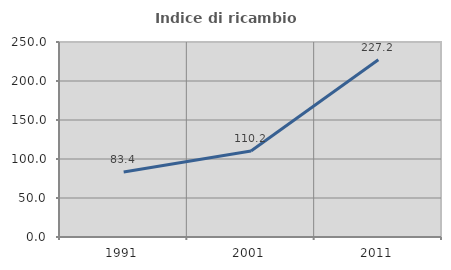
| Category | Indice di ricambio occupazionale  |
|---|---|
| 1991.0 | 83.407 |
| 2001.0 | 110.233 |
| 2011.0 | 227.236 |